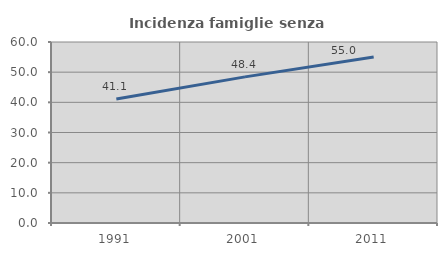
| Category | Incidenza famiglie senza nuclei |
|---|---|
| 1991.0 | 41.096 |
| 2001.0 | 48.438 |
| 2011.0 | 55 |